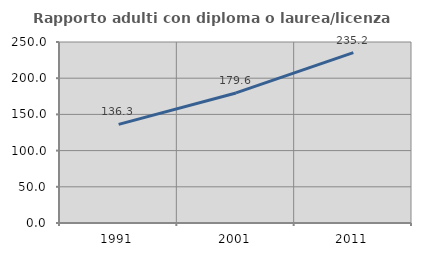
| Category | Rapporto adulti con diploma o laurea/licenza media  |
|---|---|
| 1991.0 | 136.253 |
| 2001.0 | 179.634 |
| 2011.0 | 235.232 |